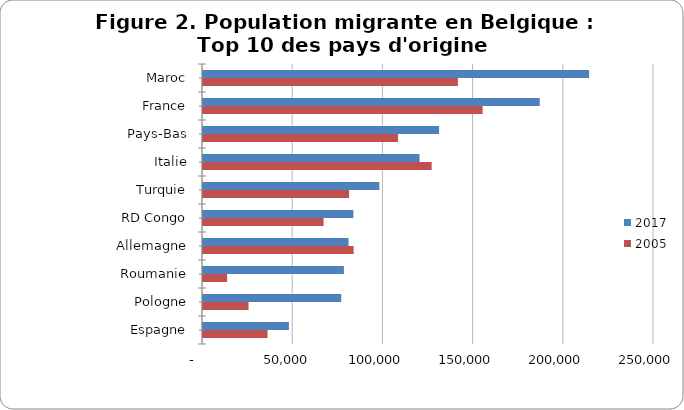
| Category | 2017 | 2005 |
|---|---|---|
| Maroc | 214046 | 141291 |
| France | 186683 | 155014 |
| Pays-Bas | 130861 | 108081 |
| Italie | 120043 | 126745 |
| Turquie | 97766 | 81010 |
| RD Congo | 83357 | 66842 |
| Allemagne | 80684 | 83491 |
| Roumanie | 78118 | 13377 |
| Pologne | 76622 | 25242 |
| Espagne | 47637 | 35780 |